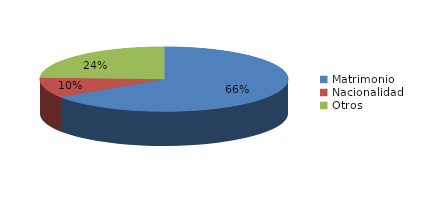
| Category | Series 0 |
|---|---|
| Matrimonio | 1075 |
| Nacionalidad | 165 |
| Otros | 399 |